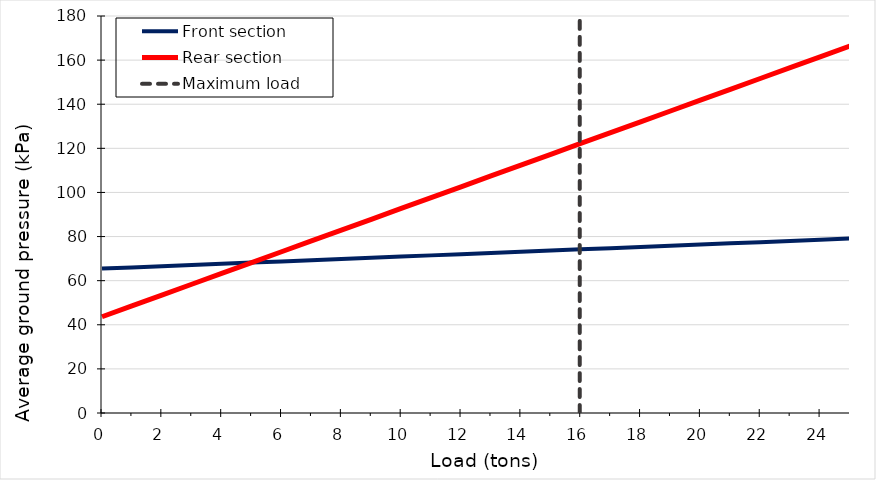
| Category | Front section | Rear section |
|---|---|---|
| 0.0 | 65.467 | 43.644 |
| 1.0 | 66.012 | 48.554 |
| 2.0 | 66.558 | 53.464 |
| 3.0 | 67.103 | 58.374 |
| 4.0 | 67.649 | 63.284 |
| 5.0 | 68.194 | 68.194 |
| 6.0 | 68.74 | 73.104 |
| 7.0 | 69.286 | 78.014 |
| 8.0 | 69.831 | 82.924 |
| 9.0 | 70.377 | 87.834 |
| 10.0 | 70.922 | 92.744 |
| 11.0 | 71.468 | 97.654 |
| 12.0 | 72.013 | 102.564 |
| 13.0 | 72.559 | 107.474 |
| 14.0 | 73.104 | 112.384 |
| 15.0 | 73.65 | 117.294 |
| 16.0 | 74.196 | 122.204 |
| 17.0 | 74.741 | 127.114 |
| 18.0 | 75.287 | 132.024 |
| 19.0 | 75.832 | 136.934 |
| 20.0 | 76.378 | 141.844 |
| 21.0 | 76.923 | 146.754 |
| 22.0 | 77.469 | 151.664 |
| 23.0 | 78.014 | 156.574 |
| 24.0 | 78.56 | 161.484 |
| 25.0 | 79.106 | 166.394 |